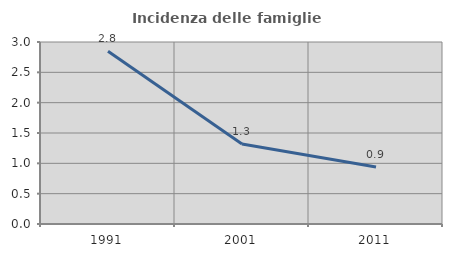
| Category | Incidenza delle famiglie numerose |
|---|---|
| 1991.0 | 2.847 |
| 2001.0 | 1.32 |
| 2011.0 | 0.94 |